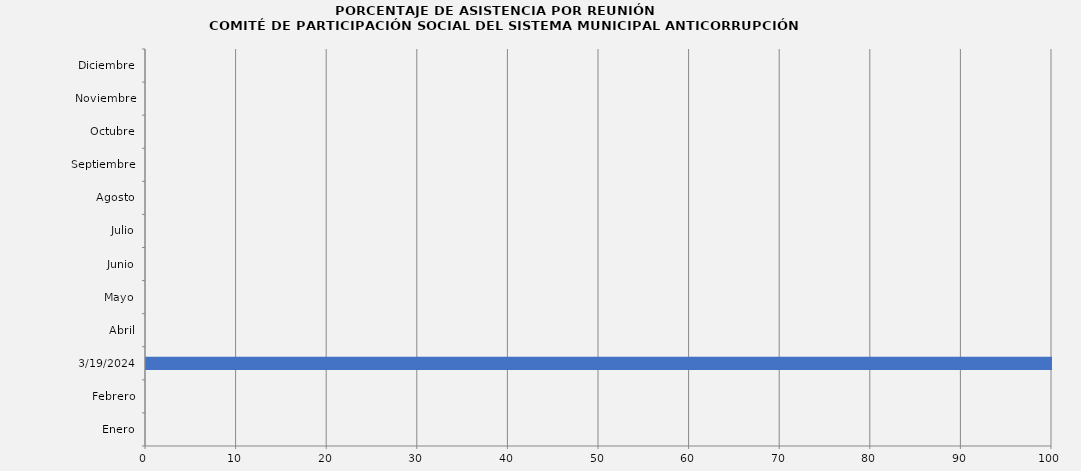
| Category | Series 0 |
|---|---|
| Enero | 0 |
| Febrero | 0 |
| 19/03/2024 | 100 |
| Abril | 0 |
| Mayo | 0 |
| Junio | 0 |
| Julio | 0 |
| Agosto | 0 |
| Septiembre | 0 |
| Octubre | 0 |
| Noviembre | 0 |
| Diciembre | 0 |